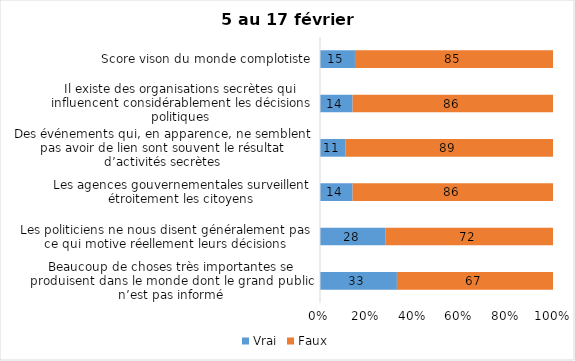
| Category | Vrai | Faux |
|---|---|---|
| Beaucoup de choses très importantes se produisent dans le monde dont le grand public n’est pas informé | 33 | 67 |
| Les politiciens ne nous disent généralement pas ce qui motive réellement leurs décisions | 28 | 72 |
| Les agences gouvernementales surveillent étroitement les citoyens | 14 | 86 |
| Des événements qui, en apparence, ne semblent pas avoir de lien sont souvent le résultat d’activités secrètes | 11 | 89 |
| Il existe des organisations secrètes qui influencent considérablement les décisions politiques | 14 | 86 |
| Score vison du monde complotiste | 15 | 85 |